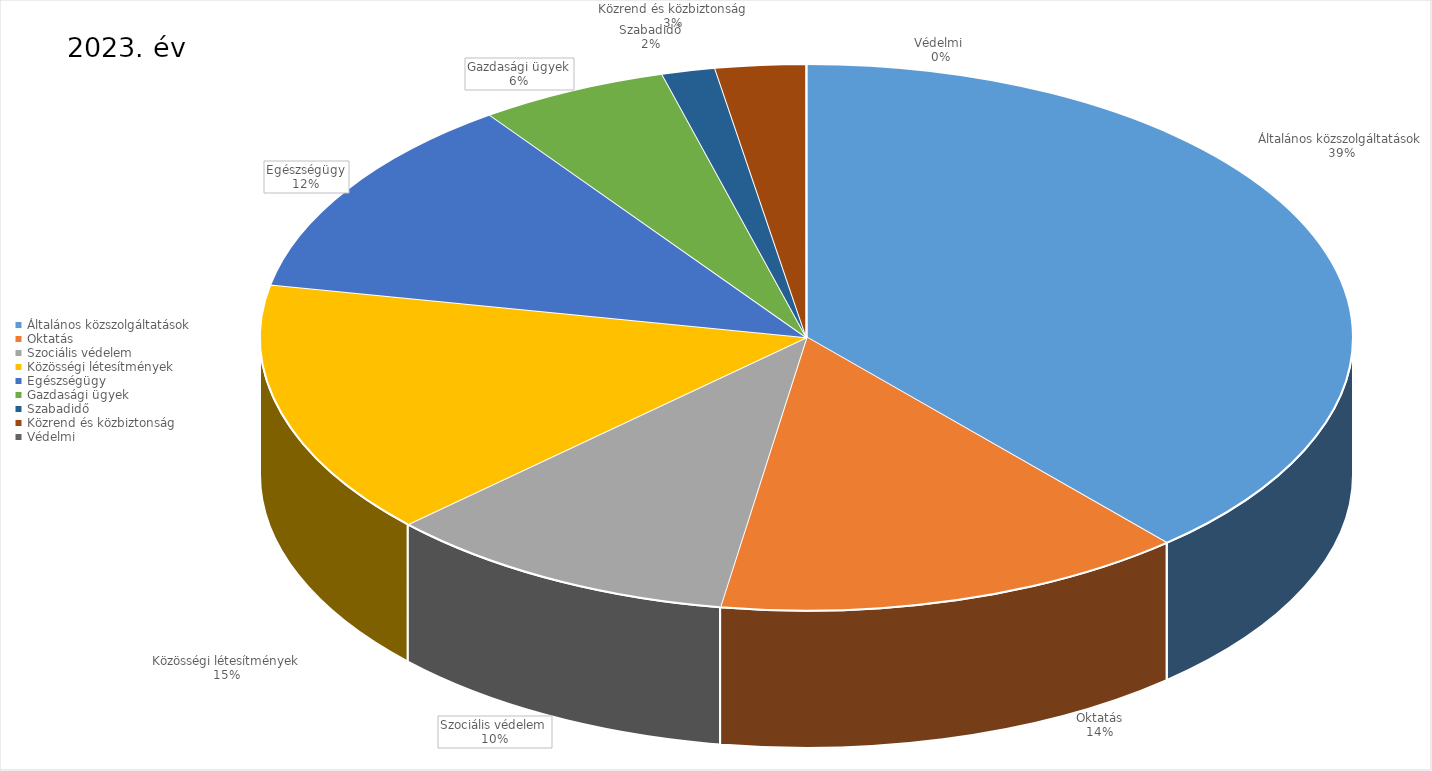
| Category | 2023. év |
|---|---|
| Általános közszolgáltatások | 18994376263 |
| Oktatás | 6885533418 |
| Szociális védelem | 5166919629 |
| Közösségi létesítmények | 7432316463 |
| Egészségügy | 5940157506 |
| Gazdasági ügyek | 2753975645 |
| Szabadidő | 778632766 |
| Közrend és közbiztonság | 1317145177 |
| Védelmi  | 2616200 |